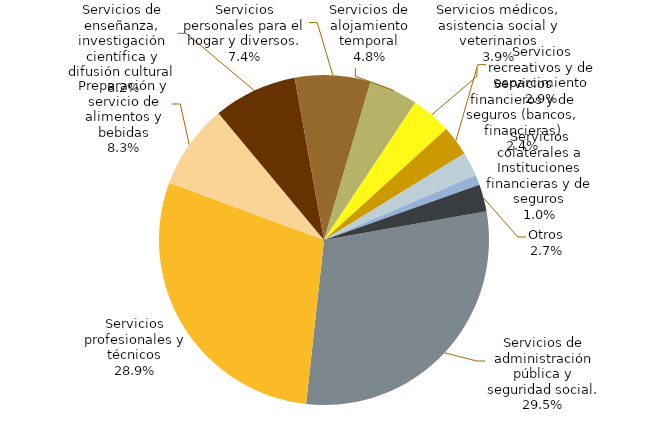
| Category | Series 0 |
|---|---|
| Servicios de administración pública y seguridad social. | 0.295 |
| Servicios profesionales y técnicos. | 0.289 |
| Preparación y servicio de alimentos y bebidas. | 0.083 |
| Servicios de enseñanza, investigación científica y difusión cultural. | 0.082 |
| Servicios personales para el hogar y diversos. | 0.074 |
| Servicios de alojamiento temporal. | 0.048 |
| Servicios médicos, asistencia social y veterinarios. | 0.039 |
| Servicios recreativos y de esparcimiento. | 0.029 |
| Servicios financieros y de seguros (bancos, financieras). | 0.024 |
| Servicios colaterales a Instituciones financieras y de seguros. | 0.01 |
| Otros | 0.027 |